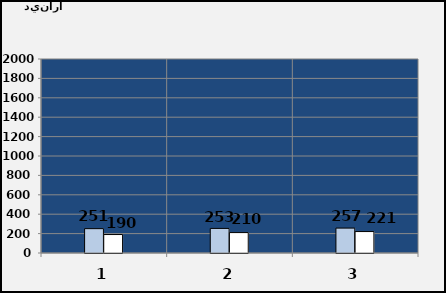
| Category | رقم المعاملات الإجمالي | رقم معاملات التصدير م.د |
|---|---|---|
| 0 | 250.999 | 190.332 |
| 1 | 253.485 | 210.48 |
| 2 | 256.828 | 221.164 |